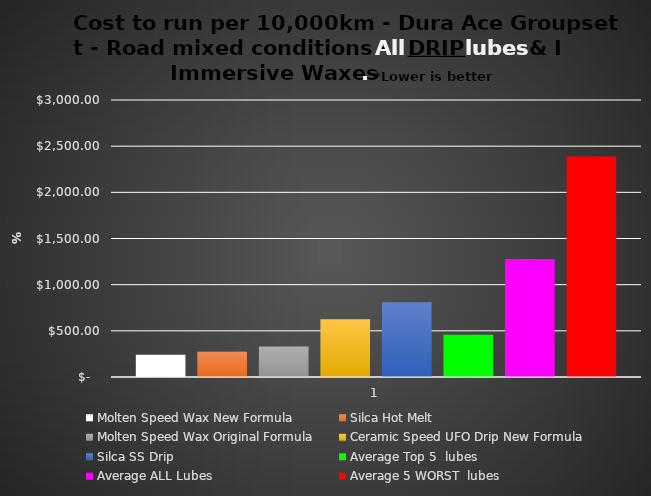
| Category | Molten Speed Wax New Formula | Silca Hot Melt | Molten Speed Wax Original Formula | Ceramic Speed UFO Drip New Formula | Silca SS Drip | Average Top 5  lubes | Average ALL Lubes | Average 5 WORST  lubes |
|---|---|---|---|---|---|---|---|---|
| 0 | 240.9 | 275.9 | 330.7 | 626.43 | 810.92 | 456.97 | 1277 | 2387 |